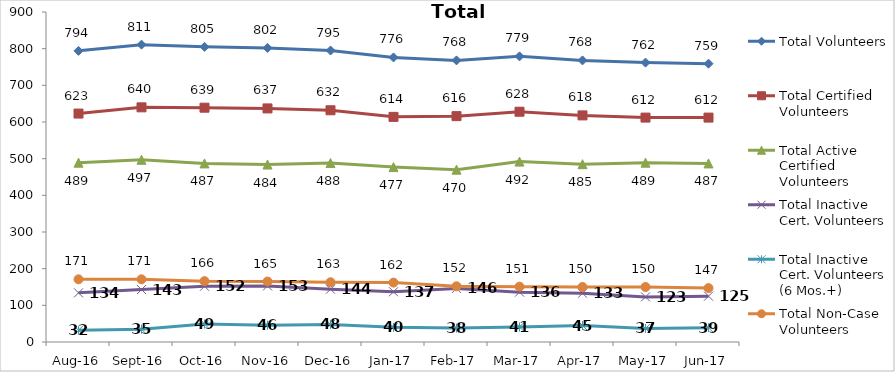
| Category | Total Volunteers | Total Certified Volunteers | Total Active Certified Volunteers | Total Inactive Cert. Volunteers | Total Inactive Cert. Volunteers (6 Mos.+) | Total Non-Case Volunteers |
|---|---|---|---|---|---|---|
| Aug-16 | 794 | 623 | 489 | 134 | 32 | 171 |
| Sep-16 | 811 | 640 | 497 | 143 | 35 | 171 |
| Oct-16 | 805 | 639 | 487 | 152 | 49 | 166 |
| Nov-16 | 802 | 637 | 484 | 153 | 46 | 165 |
| Dec-16 | 795 | 632 | 488 | 144 | 48 | 163 |
| Jan-17 | 776 | 614 | 477 | 137 | 40 | 162 |
| Feb-17 | 768 | 616 | 470 | 146 | 38 | 152 |
| Mar-17 | 779 | 628 | 492 | 136 | 41 | 151 |
| Apr-17 | 768 | 618 | 485 | 133 | 45 | 150 |
| May-17 | 762 | 612 | 489 | 123 | 37 | 150 |
| Jun-17 | 759 | 612 | 487 | 125 | 39 | 147 |